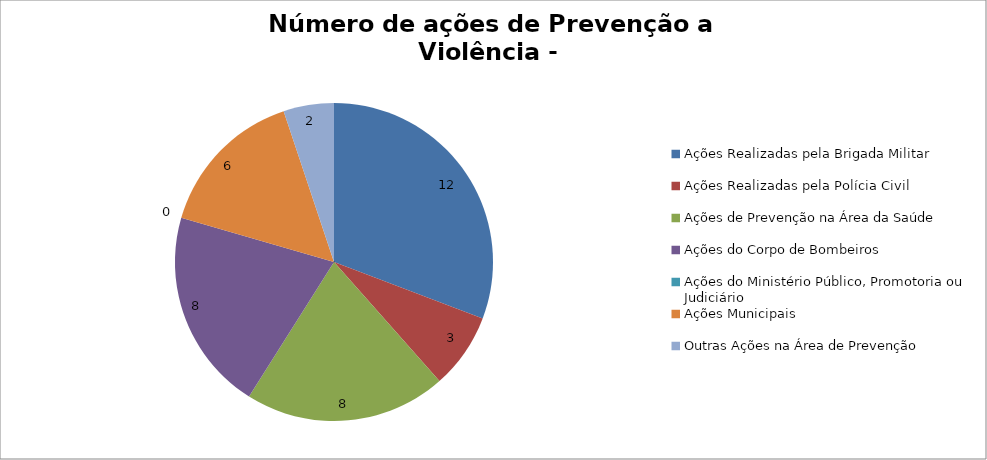
| Category | Número de Ações |
|---|---|
| Ações Realizadas pela Brigada Militar | 12 |
| Ações Realizadas pela Polícia Civil | 3 |
| Ações de Prevenção na Área da Saúde | 8 |
| Ações do Corpo de Bombeiros | 8 |
| Ações do Ministério Público, Promotoria ou Judiciário | 0 |
| Ações Municipais | 6 |
| Outras Ações na Área de Prevenção | 2 |